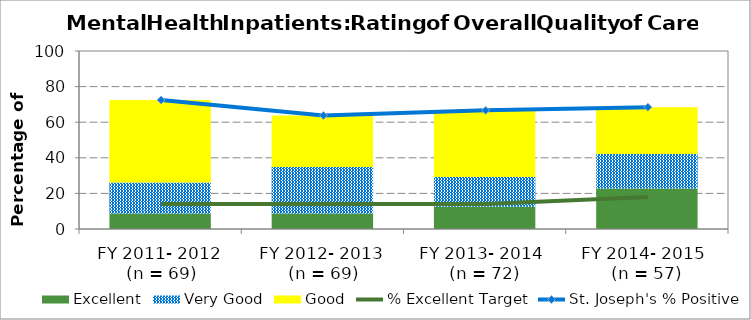
| Category | Excellent | Very Good | Good |
|---|---|---|---|
| FY 2011- 2012
 (n = 69) | 8.7 | 17.39 | 46.38 |
| FY 2012- 2013
 (n = 69) | 8.7 | 26.09 | 28.99 |
| FY 2013- 2014 
(n = 72) | 12.5 | 16.67 | 37.5 |
| FY 2014- 2015 
(n = 57) | 22.81 | 19.3 | 26.32 |